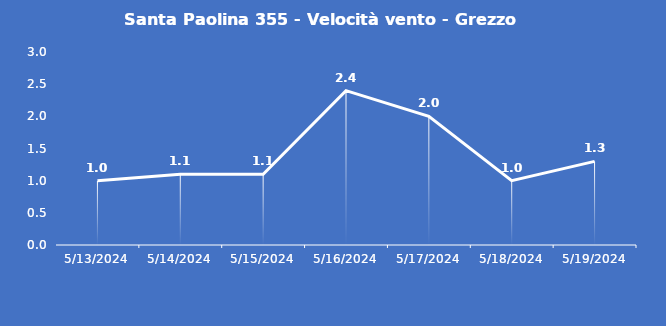
| Category | Santa Paolina 355 - Velocità vento - Grezzo (m/s) |
|---|---|
| 5/13/24 | 1 |
| 5/14/24 | 1.1 |
| 5/15/24 | 1.1 |
| 5/16/24 | 2.4 |
| 5/17/24 | 2 |
| 5/18/24 | 1 |
| 5/19/24 | 1.3 |